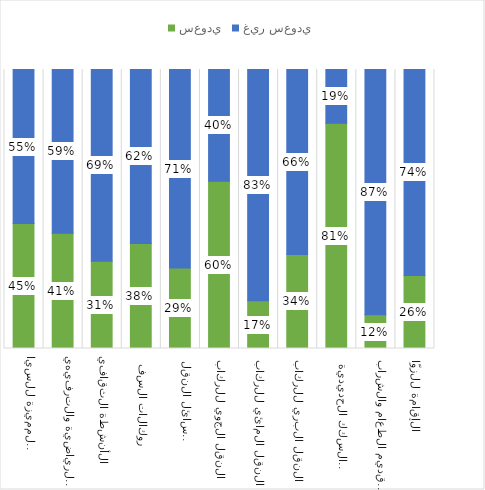
| Category | سعودي | غير سعودي |
|---|---|---|
|  الإقامة للزوّار | 0.262 | 0.738 |
| نشاط تقديم الطعام والشراب | 0.121 | 0.875 |
|  نقل الركاب بالسكك الحديدية | 0.808 | 0.192 |
|  النقل البري للركاب | 0.337 | 0.663 |
|  النقل المائي للركاب | 0.171 | 0.829 |
|  النقل الجوي للركاب | 0.599 | 0.401 |
|  استئجار وسائل النقل | 0.288 | 0.712 |
|   وكالات السفر  | 0.377 | 0.623 |
| الأنشطة الثقافية | 0.313 | 0.687 |
| الأنشطة الرياضية والترفيهية | 0.413 | 0.587 |
| الأنشطةالأخرى المميزة للسياحة | 0.448 | 0.552 |